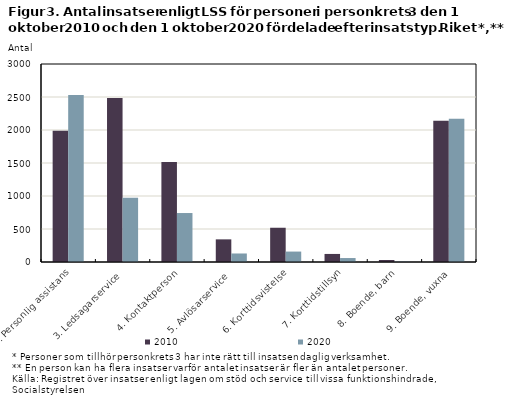
| Category | 2010 | 2020 |
|---|---|---|
| 2. Personlig assistans | 1989 | 2532 |
| 3. Ledsagarservice | 2484 | 974 |
| 4. Kontaktperson | 1515 | 742 |
| 5. Avlösarservice | 343 | 129 |
| 6. Korttidsvistelse | 519 | 158 |
| 7. Korttidstillsyn | 122 | 60 |
| 8. Boende, barn | 30 | 7 |
| 9. Boende, vuxna | 2141 | 2169 |